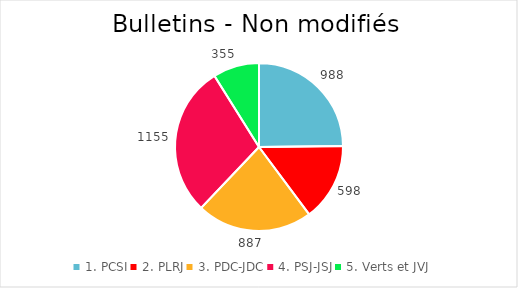
| Category | Series 0 |
|---|---|
| 1. PCSI | 988 |
| 2. PLRJ | 598 |
| 3. PDC-JDC | 887 |
| 4. PSJ-JSJ | 1155 |
| 5. Verts et JVJ | 355 |